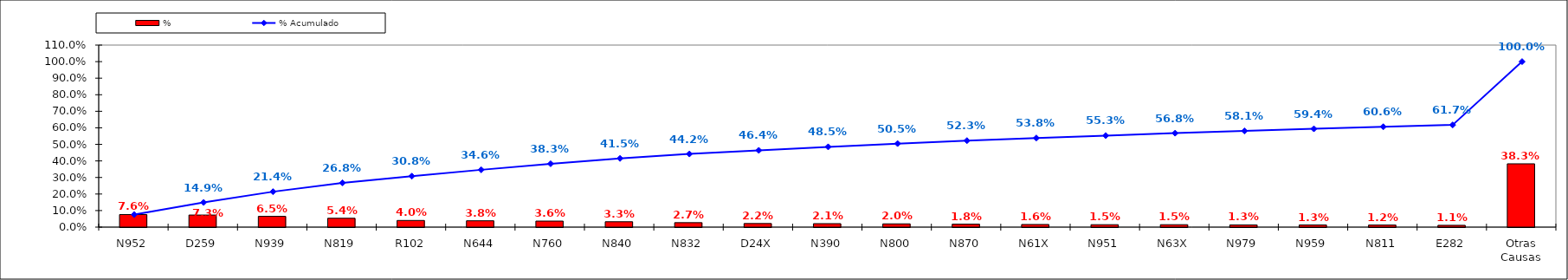
| Category | % |
|---|---|
| N952 | 0.076 |
| D259 | 0.073 |
| N939 | 0.065 |
| N819 | 0.054 |
| R102 | 0.04 |
| N644 | 0.038 |
| N760 | 0.036 |
| N840 | 0.033 |
| N832 | 0.027 |
| D24X | 0.022 |
| N390 | 0.021 |
| N800 | 0.02 |
| N870 | 0.018 |
| N61X | 0.016 |
| N951 | 0.015 |
| N63X | 0.015 |
| N979 | 0.013 |
| N959 | 0.013 |
| N811 | 0.012 |
| E282 | 0.011 |
| Otras Causas | 0.383 |